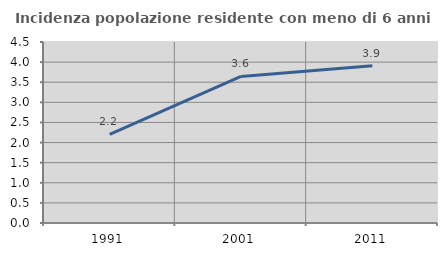
| Category | Incidenza popolazione residente con meno di 6 anni |
|---|---|
| 1991.0 | 2.201 |
| 2001.0 | 3.642 |
| 2011.0 | 3.909 |